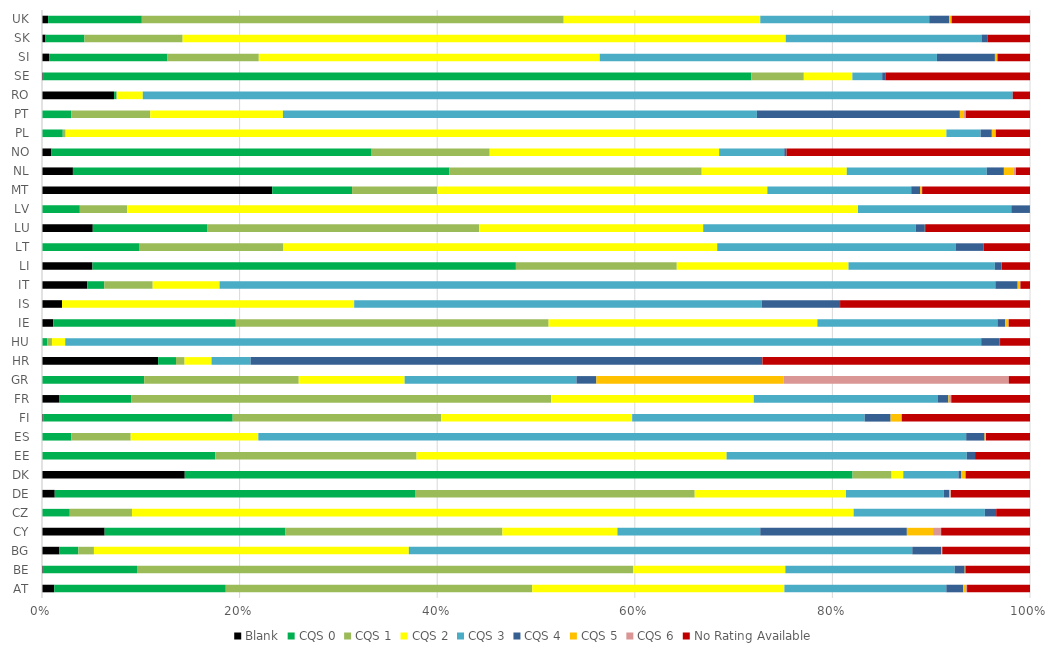
| Category | Blank | CQS 0 | CQS 1 | CQS 2 | CQS 3 | CQS 4 | CQS 5 | CQS 6 | No Rating Available |
|---|---|---|---|---|---|---|---|---|---|
| AT | 378624428.93 | 5297737482 | 9466207498.4 | 7788415342.5 | 5001536468 | 520367335.95 | 88376822.33 | 32745027.02 | 1943629129.6 |
| BE | 105582570.49 | 9768579924.2 | 51558407141 | 15826134693 | 17594972863 | 1044206797.4 | 59463138.23 | 12421737.95 | 6712111693.7 |
| BG | 32360647.62 | 34840829.16 | 28906621.45 | 582679072.21 | 931492450.62 | 53255553.55 | 2091491.91 | 154137.28 | 162339141.1 |
| CY | 51146141.64 | 147565799.59 | 177006519.12 | 93884329.04 | 116566059.24 | 119644653.16 | 21439232.65 | 6534331.76 | 72516842.49 |
| CZ | 0 | 142287056.45 | 318760451.11 | 3698359109.5 | 672245501.83 | 58239107.87 | 0 | 0 | 173311110.75 |
| DE | 7036776288.7 | 199043304505 | 153939399653 | 83431661324 | 53955405375 | 3109332742.2 | 454564643.35 | 346598358.76 | 43638157945 |
| DK | 6319915692.1 | 29559153930 | 1726972929.7 | 519551610.76 | 2439368785.4 | 113168688.56 | 189876720.14 | 13894236.69 | 2851343863.5 |
| EE | 0 | 157936164.19 | 183462954.73 | 282644711.19 | 218907335.36 | 7602750.57 | 482 | 4163.13 | 50065010.63 |
| ES | 0 | 3923020757.6 | 7913272564.2 | 17026825090 | 94445003487 | 2457311762.3 | 175492539.42 | 15077774.34 | 5869526047.4 |
| FI | 16528463.28 | 2762113039.8 | 3035324702.9 | 2785771234.8 | 3387408574.3 | 378225165.94 | 150665754.31 | 13633381.57 | 1866844238.2 |
| FR | 20304079288 | 86158456095 | 501890631067 | 242142609193 | 219552609536 | 13008298527 | 794400520 | 2577093113.1 | 94094445304 |
| GR | 100116.44 | 944549130.97 | 1428880059.5 | 979011632.67 | 1588279218.6 | 184530460.6 | 1732544273 | 2079927397.2 | 196204447.24 |
| HR | 358934064.36 | 55156820.59 | 26483458.55 | 83416381.42 | 120814620.99 | 1581194544.6 | 285140.41 | 110450.63 | 827085024.01 |
| HU | 208402.91 | 14175229.74 | 13173428.22 | 36883452.66 | 2540047740.2 | 51714420.56 | 997.9 | 529797.46 | 83065887.14 |
| IE | 430019702.29 | 6913276209.6 | 11851922734 | 10182534053 | 6822174261.4 | 298144466.45 | 119613402.26 | 7042244.46 | 808683565.6 |
| IS | 8859221.98 | 0 | 0 | 129576707.7 | 180743936.71 | 34739593.31 | 0 | 0 | 84219093.47 |
| IT | 13945424583 | 5200409929.2 | 14888023574 | 20573124128 | 238519002394 | 6866998887.8 | 524645761.99 | 320465881.56 | 2944054383.8 |
| LI | 85387194.53 | 715955306.23 | 272069208.44 | 290386989.19 | 247472869.05 | 10701096.5 | 411732.87 | 0 | 48298458.05 |
| LT | 0 | 56024240.75 | 82494315.2 | 248952731.77 | 136992414.99 | 15840012.82 | 0 | 0 | 26634364.62 |
| LU | 1381028054.9 | 3107094685.5 | 7398182807.4 | 6092112619.3 | 5782203806.4 | 244801063.54 | 7257600.95 | 95.6 | 2850733934.8 |
| LV | 0 | 10816849.23 | 13504932.77 | 208991743.91 | 43829149 | 5324562.2 | 0 | 0 | 22500 |
| MT | 354867258.21 | 123034379.99 | 131204921.59 | 508873203.8 | 221725506.47 | 13882828.39 | 2974233.74 | 0 | 166204542.69 |
| NL | 727710730.56 | 8861356376 | 5934436484.4 | 3413768545.5 | 3292913187 | 404071050 | 235933893.27 | 46600071.6 | 332013239.45 |
| NO | 487706126.92 | 16449413994 | 6066382152 | 11791711682 | 3341948786 | 118018385.09 | 422902.94 | 802302.59 | 12508035085 |
| PL | 0 | 368119438.54 | 50599820.82 | 15603895760 | 605612507.09 | 199663532.86 | 69689530.58 | 0 | 606413931.08 |
| PT | 0 | 869287021.44 | 2354863110 | 3950999920.8 | 14114273557 | 6045497701.4 | 122316263.18 | 51539327.97 | 1914401763.7 |
| RO | 102708938.24 | 3266247.08 | 942236.4 | 36741522.71 | 1239755226.1 | 14990.3 | 0 | 0 | 24631226.54 |
| SE | 62918738.18 | 42995183836 | 3189088016.3 | 2946847170.8 | 1808297683 | 172649788.56 | 12560044.61 | 3243457.15 | 8786238497.6 |
| SI | 24306660.25 | 404921106.06 | 312149137.1 | 1165975996.6 | 1152908489.3 | 198396074.12 | 8558413.33 | 0 | 111397464.83 |
| SK | 9902353.64 | 109260791.09 | 275596889.62 | 1693083960.2 | 549474510.83 | 16459966.97 | 0 | 0 | 119703754.48 |
| UK | 872796951.93 | 13394552308 | 60298075992 | 28097571386 | 24145455138 | 2865803720.5 | 267591631.77 | 71892618.37 | 11199450079 |